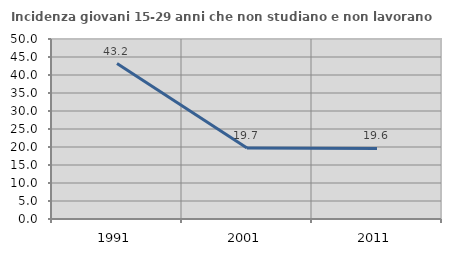
| Category | Incidenza giovani 15-29 anni che non studiano e non lavorano  |
|---|---|
| 1991.0 | 43.169 |
| 2001.0 | 19.706 |
| 2011.0 | 19.597 |